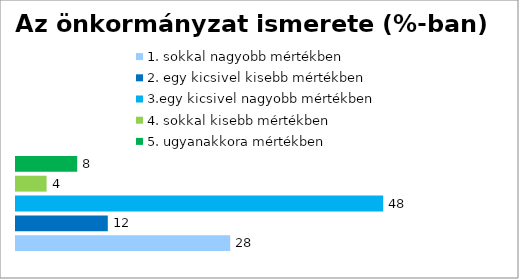
| Category | 1. sokkal nagyobb mértékben | 2. egy kicsivel kisebb mértékben | 3.egy kicsivel nagyobb mértékben | 4. sokkal kisebb mértékben | 5. ugyanakkora mértékben |
|---|---|---|---|---|---|
| 0 | 28 | 12 | 48 | 4 | 8 |